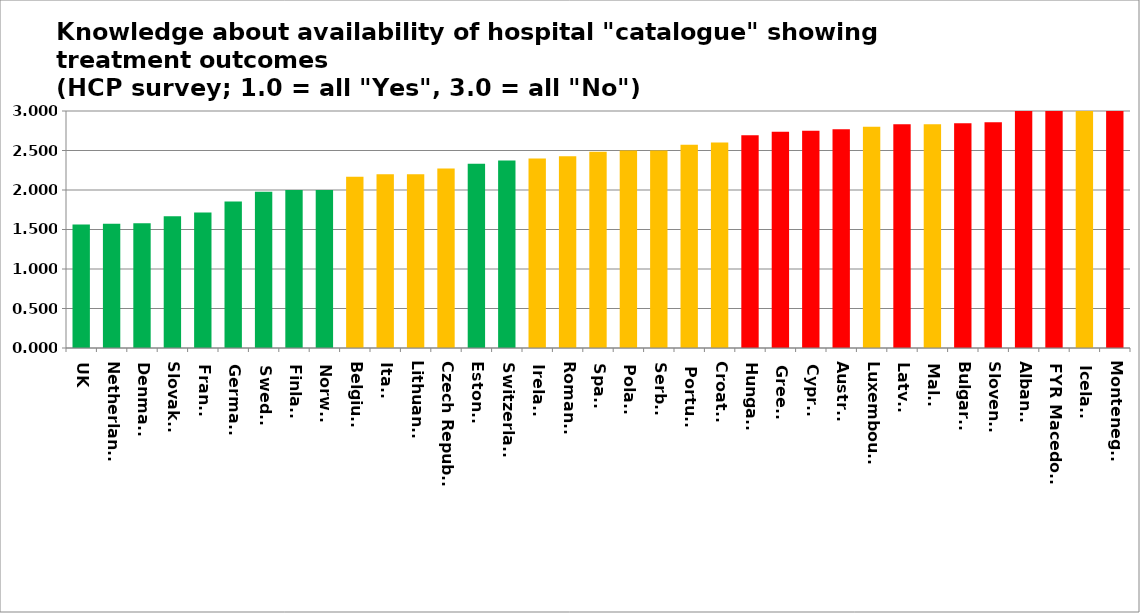
| Category | Series 0 |
|---|---|
| UK | 1.564 |
| Netherlands | 1.571 |
| Denmark | 1.579 |
| Slovakia | 1.667 |
| France | 1.716 |
| Germany | 1.855 |
| Sweden | 1.978 |
| Finland | 2 |
| Norway | 2 |
| Belgium | 2.167 |
| Italy | 2.198 |
| Lithuania | 2.2 |
| Czech Republic | 2.273 |
| Estonia | 2.333 |
| Switzerland | 2.375 |
| Ireland | 2.4 |
| Romania | 2.429 |
| Spain | 2.483 |
| Poland | 2.5 |
| Serbia | 2.5 |
| Portugal | 2.571 |
| Croatia | 2.6 |
| Hungary | 2.692 |
| Greece | 2.737 |
| Cyprus | 2.75 |
| Austria | 2.769 |
| Luxembourg | 2.8 |
| Latvia | 2.833 |
| Malta | 2.833 |
| Bulgaria | 2.846 |
| Slovenia | 2.857 |
| Albania | 3 |
| FYR Macedonia | 3 |
| Iceland | 3 |
| Montenegro | 3 |